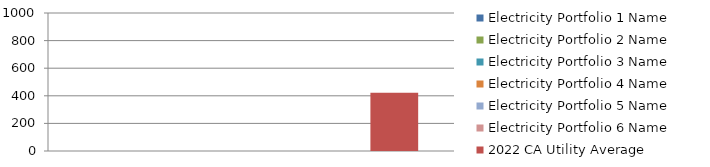
| Category | Electricity Portfolio 1 Name | Electricity Portfolio 2 Name | Electricity Portfolio 3 Name | Electricity Portfolio 4 Name | Electricity Portfolio 5 Name | Electricity Portfolio 6 Name | 2022 CA Utility Average |
|---|---|---|---|---|---|---|---|
| 0 | 0 | 0 | 0 | 0 | 0 | 0 | 422 |